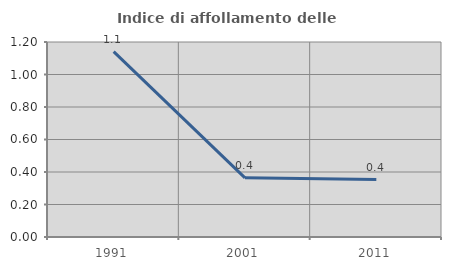
| Category | Indice di affollamento delle abitazioni  |
|---|---|
| 1991.0 | 1.141 |
| 2001.0 | 0.364 |
| 2011.0 | 0.354 |